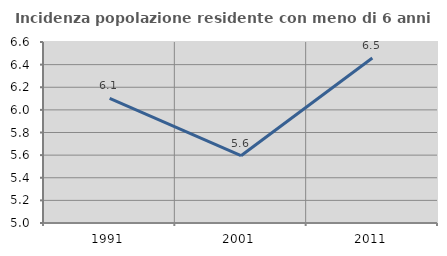
| Category | Incidenza popolazione residente con meno di 6 anni |
|---|---|
| 1991.0 | 6.102 |
| 2001.0 | 5.595 |
| 2011.0 | 6.459 |